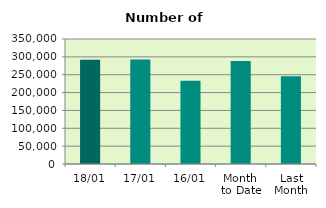
| Category | Series 0 |
|---|---|
| 18/01 | 291852 |
| 17/01 | 292610 |
| 16/01 | 233352 |
| Month 
to Date | 288321.231 |
| Last
Month | 245553.619 |